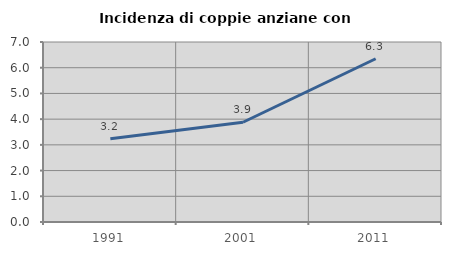
| Category | Incidenza di coppie anziane con figli |
|---|---|
| 1991.0 | 3.239 |
| 2001.0 | 3.879 |
| 2011.0 | 6.349 |